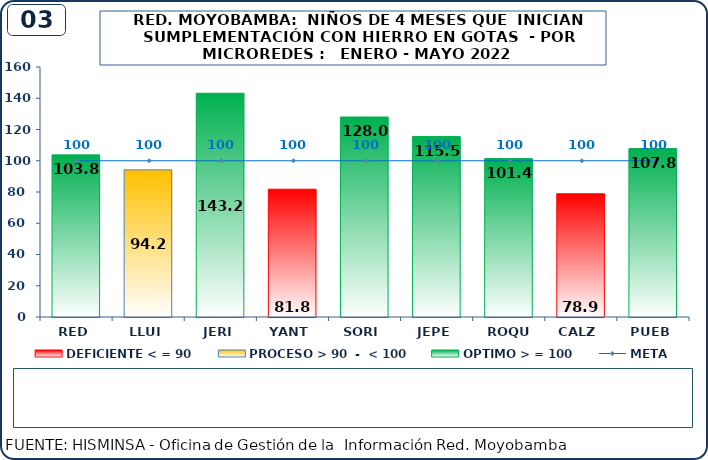
| Category | DEFICIENTE < = 90 | PROCESO > 90  -  < 100 | OPTIMO > = 100 |
|---|---|---|---|
| RED | 0 | 0 | 103.8 |
| LLUI | 0 | 94.2 | 0 |
| JERI | 0 | 0 | 143.2 |
| YANT | 81.8 | 0 | 0 |
| SORI | 0 | 0 | 128 |
| JEPE | 0 | 0 | 115.5 |
| ROQU | 0 | 0 | 101.4 |
| CALZ | 78.9 | 0 | 0 |
| PUEB | 0 | 0 | 107.8 |